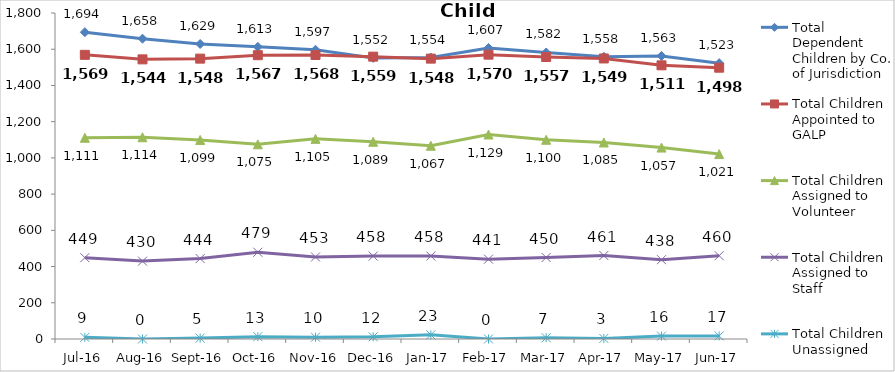
| Category | Total Dependent Children by Co. of Jurisdiction | Total Children Appointed to GALP | Total Children Assigned to Volunteer | Total Children Assigned to Staff | Total Children Unassigned |
|---|---|---|---|---|---|
| Jul-16 | 1694 | 1569 | 1111 | 449 | 9 |
| Aug-16 | 1658 | 1544 | 1114 | 430 | 0 |
| Sep-16 | 1629 | 1548 | 1099 | 444 | 5 |
| Oct-16 | 1613 | 1567 | 1075 | 479 | 13 |
| Nov-16 | 1597 | 1568 | 1105 | 453 | 10 |
| Dec-16 | 1552 | 1559 | 1089 | 458 | 12 |
| Jan-17 | 1554 | 1548 | 1067 | 458 | 23 |
| Feb-17 | 1607 | 1570 | 1129 | 441 | 0 |
| Mar-17 | 1582 | 1557 | 1100 | 450 | 7 |
| Apr-17 | 1558 | 1549 | 1085 | 461 | 3 |
| May-17 | 1563 | 1511 | 1057 | 438 | 16 |
| Jun-17 | 1523 | 1498 | 1021 | 460 | 17 |